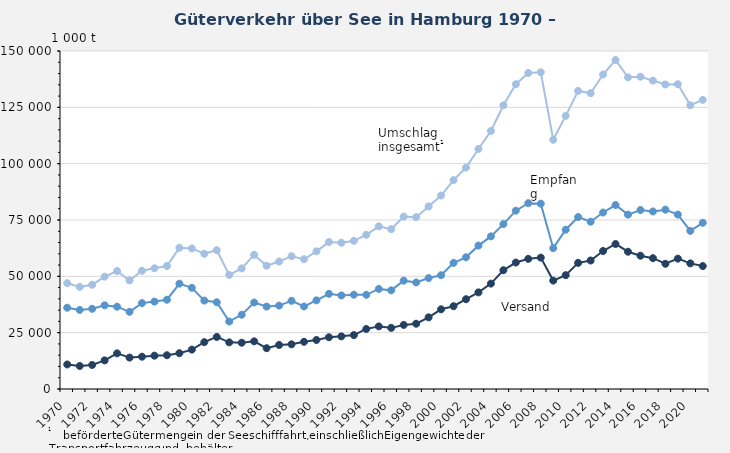
| Category | Umschlag insgesamt1 | Empfang | Versand |
|---|---|---|---|
| 1970.0 | 46959 | 36069 | 10890 |
| 1971.0 | 45303 | 35090 | 10213 |
| 1972.0 | 46255 | 35581 | 10674 |
| 1973.0 | 49850 | 37154 | 12696 |
| 1974.0 | 52349 | 36527 | 15822 |
| 1975.0 | 48181 | 34240 | 13941 |
| 1976.0 | 52460 | 38120 | 14340 |
| 1977.0 | 53574 | 38788 | 14786 |
| 1978.0 | 54596 | 39614 | 14982 |
| 1979.0 | 62650 | 46758 | 15892 |
| 1980.0 | 62393 | 44911 | 17482 |
| 1981.0 | 60027 | 39234 | 20793 |
| 1982.0 | 61581 | 38482 | 23099 |
| 1983.0 | 50631 | 29935 | 20696 |
| 1984.0 | 53488 | 32959 | 20529 |
| 1985.0 | 59535 | 38380 | 21155 |
| 1986.0 | 54696 | 36584 | 18112 |
| 1987.0 | 56570 | 37026 | 19544 |
| 1988.0 | 58942 | 39114 | 19828 |
| 1989.0 | 57582 | 36630 | 20952 |
| 1990.0 | 61098 | 39340 | 21758 |
| 1991.0 | 65204 | 42243 | 22961 |
| 1992.0 | 64881 | 41522 | 23359 |
| 1993.0 | 65772 | 41846 | 23926 |
| 1994.0 | 68439 | 41799 | 26640 |
| 1995.0 | 72189 | 44404 | 27785 |
| 1996.0 | 70920 | 43782 | 27138 |
| 1997.0 | 76503 | 48077 | 28426 |
| 1998.0 | 76264 | 47298 | 28966 |
| 1999.0 | 81036 | 49232 | 31805 |
| 2000.0 | 85863 | 50493 | 35370 |
| 2001.0 | 92709 | 55960 | 36749 |
| 2002.0 | 98272 | 58439 | 39833 |
| 2003.0 | 106536 | 63649 | 42887 |
| 2004.0 | 114501 | 67731 | 46770 |
| 2005.0 | 125894 | 73183 | 52711 |
| 2006.0 | 135259 | 79137 | 56122 |
| 2007.0 | 140236 | 82472 | 57764 |
| 2008.0 | 140562 | 82255 | 58307 |
| 2009.0 | 110604 | 62497 | 48107 |
| 2010.0 | 121222 | 70700 | 50522 |
| 2011.0 | 132293 | 76315 | 55978 |
| 2012.0 | 131269 | 74237 | 57033 |
| 2013.0 | 139573 | 78335 | 61238 |
| 2014.0 | 146000 | 81648 | 64352 |
| 2015.0 | 138311 | 77387 | 60925 |
| 2016.0 | 138585 | 79435 | 59151 |
| 2017.0 | 136839 | 78781 | 58057 |
| 2018.0 | 135163 | 79587 | 55577 |
| 2019.0 | 135271 | 77410 | 57860 |
| 2020.0 | 125911 | 70166 | 55745 |
| 2021.0 | 128307 | 73758 | 54549 |